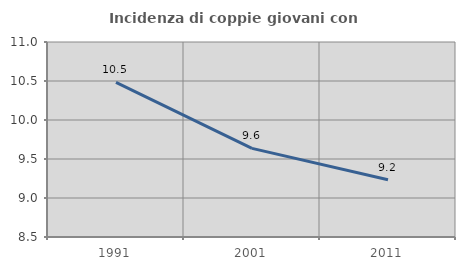
| Category | Incidenza di coppie giovani con figli |
|---|---|
| 1991.0 | 10.481 |
| 2001.0 | 9.637 |
| 2011.0 | 9.233 |